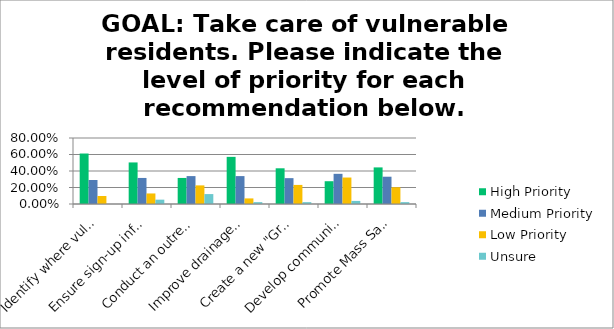
| Category | High Priority | Medium Priority | Low Priority | Unsure |
|---|---|---|---|---|
| Identify where vulnerable residents live for check-ins and partner with the Council on Aging and utilities as necessary. | 0.612 | 0.291 | 0.097 | 0 |
| Ensure sign-up information for the Rave Reverse 911 communications system is easily accessible online, sent in the mail, and posted in relevant locations. | 0.504 | 0.316 | 0.128 | 0.053 |
| Conduct an outreach campaign to achieve 100% participation for Rave. | 0.316 | 0.338 | 0.226 | 0.12 |
| Improve drainage and identify areas at high risk for mosquito gestation; increase public awareness around mosquitos and vector-borne disease. | 0.571 | 0.338 | 0.068 | 0.023 |
| Create a new "Green Committee" to work on trails and open space, host events to promote sense of place and teach wayfinding. | 0.433 | 0.313 | 0.231 | 0.022 |
| Develop community gardens located near residential developments without yards. | 0.276 | 0.366 | 0.321 | 0.037 |
| Promote Mass Save no-cost Home and Business Energy Assessments and other related no-cost opportunities, targeting vulnerable residents and businesses to help them save money. | 0.444 | 0.331 | 0.203 | 0.023 |